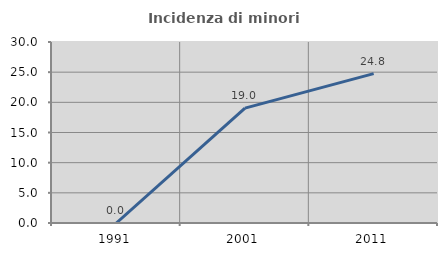
| Category | Incidenza di minori stranieri |
|---|---|
| 1991.0 | 0 |
| 2001.0 | 19.048 |
| 2011.0 | 24.762 |